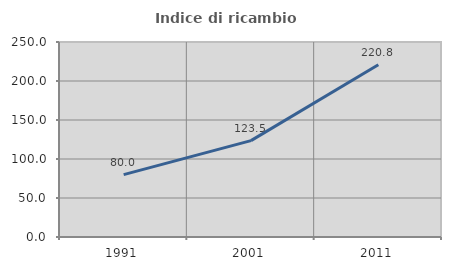
| Category | Indice di ricambio occupazionale  |
|---|---|
| 1991.0 | 80 |
| 2001.0 | 123.529 |
| 2011.0 | 220.833 |